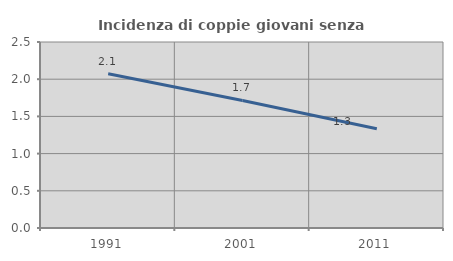
| Category | Incidenza di coppie giovani senza figli |
|---|---|
| 1991.0 | 2.073 |
| 2001.0 | 1.714 |
| 2011.0 | 1.333 |